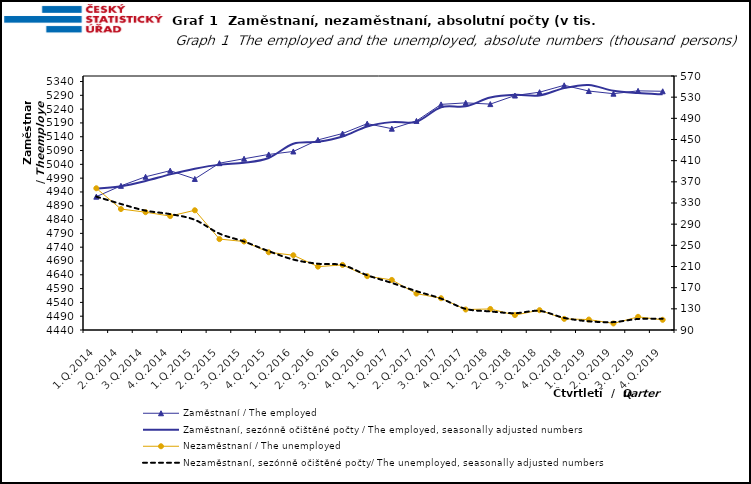
| Category | Zaměstnaní / The employed | Zaměstnaní, sezónně očištěné počty / The employed, seasonally adjusted numbers |
|---|---|---|
| 1.Q.2014 | 4922.963 | 4952.405 |
| 2.Q.2014 | 4962.219 | 4960.65 |
| 3.Q.2014 | 4994.947 | 4979.618 |
| 4.Q.2014 | 5017.051 | 5003.629 |
| 1.Q.2015 | 4987.141 | 5023.827 |
| 2.Q.2015 | 5044.285 | 5038.984 |
| 3.Q.2015 | 5060.3 | 5045.647 |
| 4.Q.2015 | 5075.884 | 5063.085 |
| 1.Q.2016 | 5086.671 | 5114.698 |
| 2.Q.2016 | 5128.493 | 5121.602 |
| 3.Q.2016 | 5151.712 | 5140.967 |
| 4.Q.2016 | 5187.436 | 5177.35 |
| 1.Q.2017 | 5169.203 | 5192.941 |
| 2.Q.2017 | 5197.265 | 5194.555 |
| 3.Q.2017 | 5257.26 | 5246.726 |
| 4.Q.2017 | 5262.691 | 5250.237 |
| 1.Q.2018 | 5258.225 | 5281.99 |
| 2.Q.2018 | 5289.242 | 5291.982 |
| 3.Q.2018 | 5301.361 | 5289.641 |
| 4.Q.2018 | 5326.327 | 5316.128 |
| 1.Q.2019 | 5305.534 | 5327.565 |
| 2.Q.2019 | 5295.929 | 5306.306 |
| 3.Q.2019 | 5306.247 | 5298.103 |
| 4.Q.2019 | 5304.7 | 5293.467 |